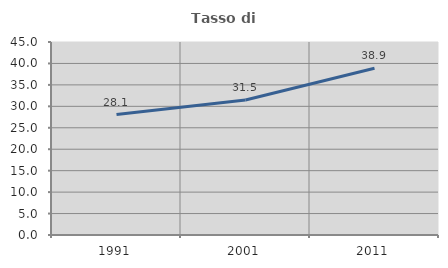
| Category | Tasso di occupazione   |
|---|---|
| 1991.0 | 28.093 |
| 2001.0 | 31.469 |
| 2011.0 | 38.871 |